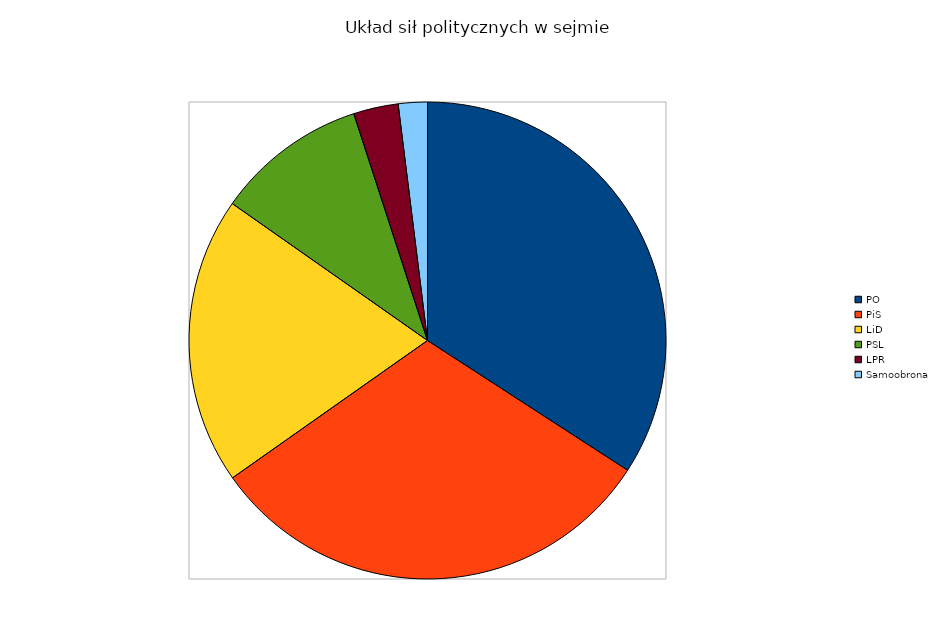
| Category | Series 0 |
|---|---|
| PO | 2499 |
| PiS | 2274 |
| LiD | 1427 |
| PSL | 751 |
| LPR | 222 |
| Samoobrona | 144 |